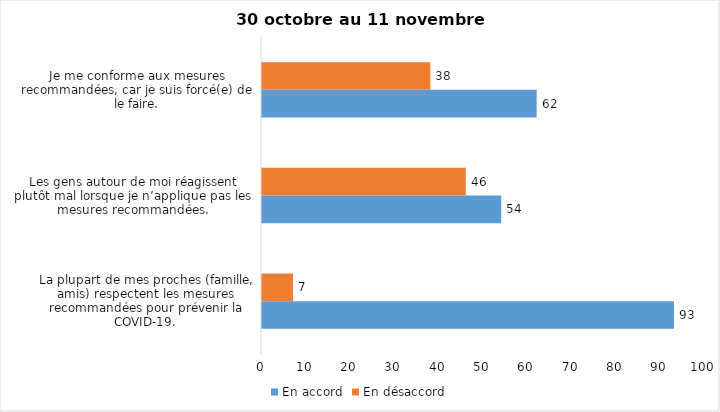
| Category | En accord | En désaccord |
|---|---|---|
| La plupart de mes proches (famille, amis) respectent les mesures recommandées pour prévenir la COVID-19. | 93 | 7 |
| Les gens autour de moi réagissent plutôt mal lorsque je n’applique pas les mesures recommandées. | 54 | 46 |
| Je me conforme aux mesures recommandées, car je suis forcé(e) de le faire. | 62 | 38 |